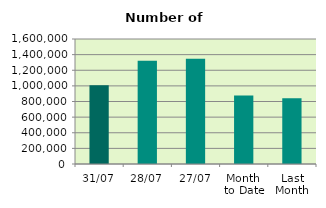
| Category | Series 0 |
|---|---|
| 31/07 | 1007852 |
| 28/07 | 1323044 |
| 27/07 | 1348008 |
| Month 
to Date | 877151.619 |
| Last
Month | 840506.364 |